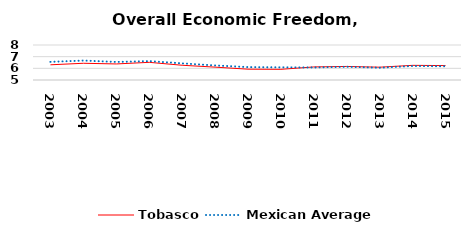
| Category | Tobasco | Mexican Average  |
|---|---|---|
| 2003.0 | 6.302 | 6.552 |
| 2004.0 | 6.434 | 6.668 |
| 2005.0 | 6.376 | 6.546 |
| 2006.0 | 6.514 | 6.619 |
| 2007.0 | 6.264 | 6.428 |
| 2008.0 | 6.104 | 6.248 |
| 2009.0 | 5.927 | 6.106 |
| 2010.0 | 5.916 | 6.086 |
| 2011.0 | 6.12 | 6.074 |
| 2012.0 | 6.162 | 6.134 |
| 2013.0 | 6.098 | 6.054 |
| 2014.0 | 6.256 | 6.2 |
| 2015.0 | 6.235 | 6.174 |